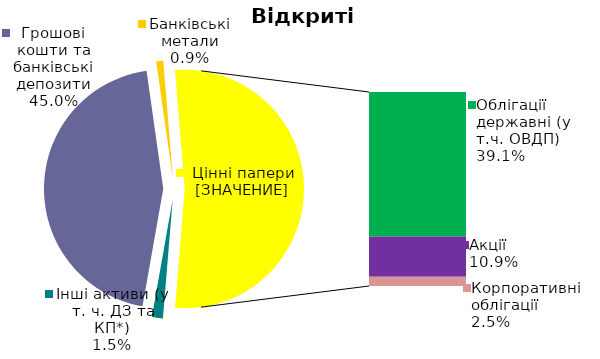
| Category | Series 0 |
|---|---|
| Інші активи (у т. ч. ДЗ та КП*) | 0.015 |
| Грошові кошти та банківські депозити | 0.45 |
| Банківські метали | 0.009 |
| Облігації державні (у т.ч. ОВДП) | 0.391 |
| Облігації місцевих позик | 0 |
| Акцiї | 0.109 |
| Корпоративні облігації | 0.025 |